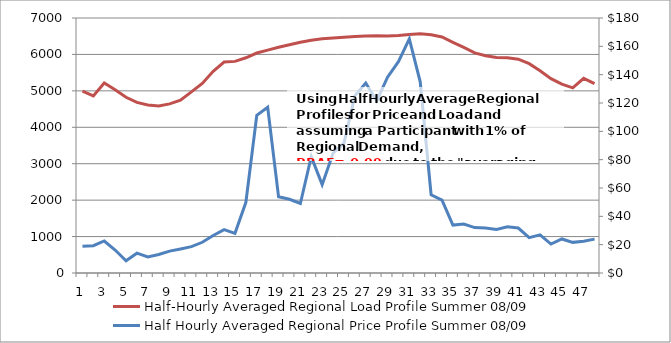
| Category | Half-Hourly Averaged Regional Load Profile Summer 08/09 |
|---|---|
| 0 | 4991.203 |
| 1 | 4862.738 |
| 2 | 5216.87 |
| 3 | 5030.563 |
| 4 | 4823.184 |
| 5 | 4682.463 |
| 6 | 4609.991 |
| 7 | 4582.203 |
| 8 | 4641.382 |
| 9 | 4743.983 |
| 10 | 4971.824 |
| 11 | 5204.335 |
| 12 | 5538.496 |
| 13 | 5792.57 |
| 14 | 5809.332 |
| 15 | 5908.144 |
| 16 | 6038.477 |
| 17 | 6118.567 |
| 18 | 6198.425 |
| 19 | 6265.851 |
| 20 | 6332.264 |
| 21 | 6386.879 |
| 22 | 6428.694 |
| 23 | 6452.303 |
| 24 | 6474.618 |
| 25 | 6490.935 |
| 26 | 6502.507 |
| 27 | 6514.817 |
| 28 | 6508.345 |
| 29 | 6518.595 |
| 30 | 6548.028 |
| 31 | 6570.446 |
| 32 | 6540.927 |
| 33 | 6481.057 |
| 34 | 6333.079 |
| 35 | 6190.942 |
| 36 | 6042.042 |
| 37 | 5962.567 |
| 38 | 5913.799 |
| 39 | 5909.471 |
| 40 | 5868.125 |
| 41 | 5746.259 |
| 42 | 5549.538 |
| 43 | 5336.233 |
| 44 | 5182.894 |
| 45 | 5082.731 |
| 46 | 5342.024 |
| 47 | 5196.333 |